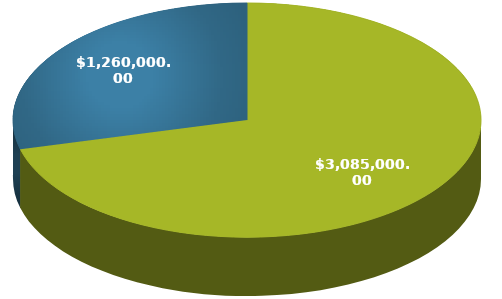
| Category | Series 0 |
|---|---|
| 0 | 3085000 |
| 1 | 1260000 |